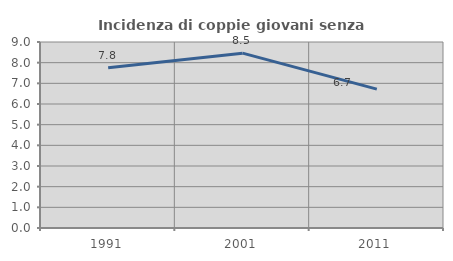
| Category | Incidenza di coppie giovani senza figli |
|---|---|
| 1991.0 | 7.759 |
| 2001.0 | 8.46 |
| 2011.0 | 6.721 |